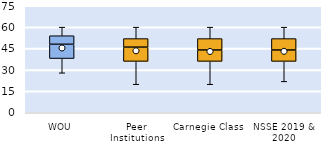
| Category | 25th | 50th | 75th |
|---|---|---|---|
| WOU | 38 | 10 | 6 |
| Peer Institutions | 36 | 10 | 6 |
| Carnegie Class | 36 | 8 | 8 |
| NSSE 2019 & 2020 | 36 | 8 | 8 |